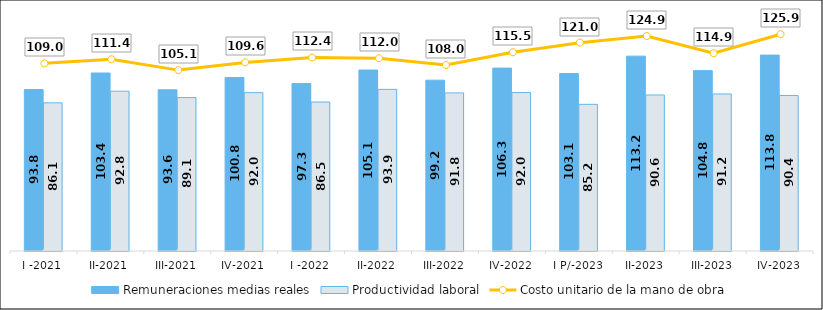
| Category | Remuneraciones medias reales | Productividad laboral |
|---|---|---|
| I -2021 | 93.821 | 86.07 |
| II-2021 | 103.4 | 92.829 |
| III-2021 | 93.648 | 89.119 |
| IV-2021 | 100.792 | 91.993 |
| I -2022 | 97.315 | 86.545 |
| II-2022 | 105.143 | 93.895 |
| III-2022 | 99.224 | 91.841 |
| IV-2022 | 106.261 | 92.034 |
| I P/-2023 | 103.109 | 85.196 |
| II-2023 | 113.192 | 90.636 |
| III-2023 | 104.79 | 91.208 |
| IV-2023 | 113.797 | 90.352 |